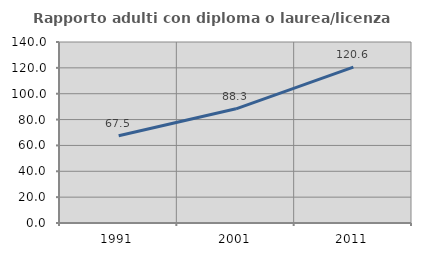
| Category | Rapporto adulti con diploma o laurea/licenza media  |
|---|---|
| 1991.0 | 67.461 |
| 2001.0 | 88.323 |
| 2011.0 | 120.566 |